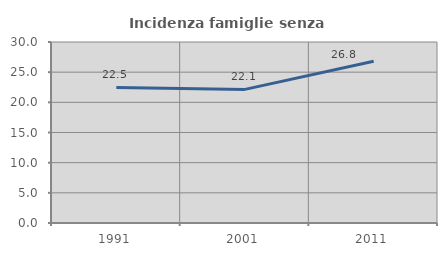
| Category | Incidenza famiglie senza nuclei |
|---|---|
| 1991.0 | 22.475 |
| 2001.0 | 22.146 |
| 2011.0 | 26.8 |